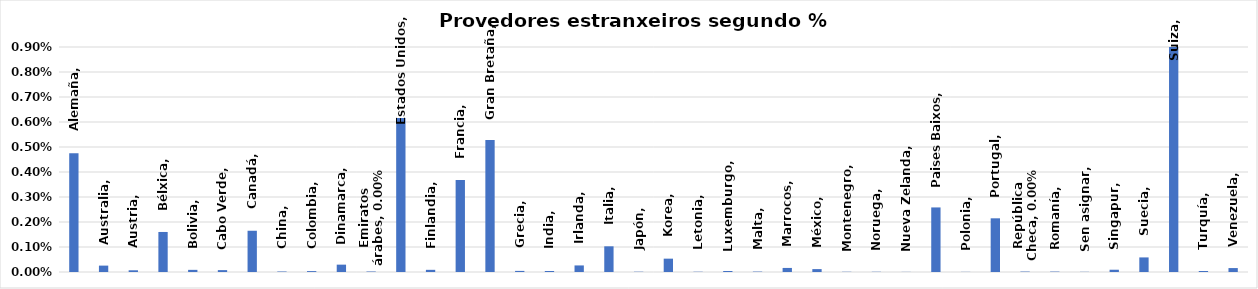
| Category | Series 0 |
|---|---|
| Alemaña | 0.005 |
| Australia | 0 |
| Austria | 0 |
| Bélxica | 0.002 |
| Bolivia | 0 |
| Cabo Verde | 0 |
| Canadá | 0.002 |
| China | 0 |
| Colombia | 0 |
| Dinamarca | 0 |
| Emiratos árabes | 0 |
| Estados Unidos | 0.006 |
| Finlandia | 0 |
| Francia | 0.004 |
| Gran Bretaña | 0.005 |
| Grecia | 0 |
| India | 0 |
| Irlanda | 0 |
| Italia | 0.001 |
| Japón | 0 |
| Korea | 0.001 |
| Letonia | 0 |
| Luxemburgo | 0 |
| Malta | 0 |
| Marrocos | 0 |
| México | 0 |
| Montenegro | 0 |
| Noruega | 0 |
| Nueva Zelanda | 0 |
| Paises Baixos | 0.003 |
| Polonia | 0 |
| Portugal | 0.002 |
| República Checa | 0 |
| Romanía | 0 |
| Sen asignar | 0 |
| Singapur | 0 |
| Suecia | 0.001 |
| Suiza | 0.013 |
| Turquía | 0 |
| Venezuela | 0 |